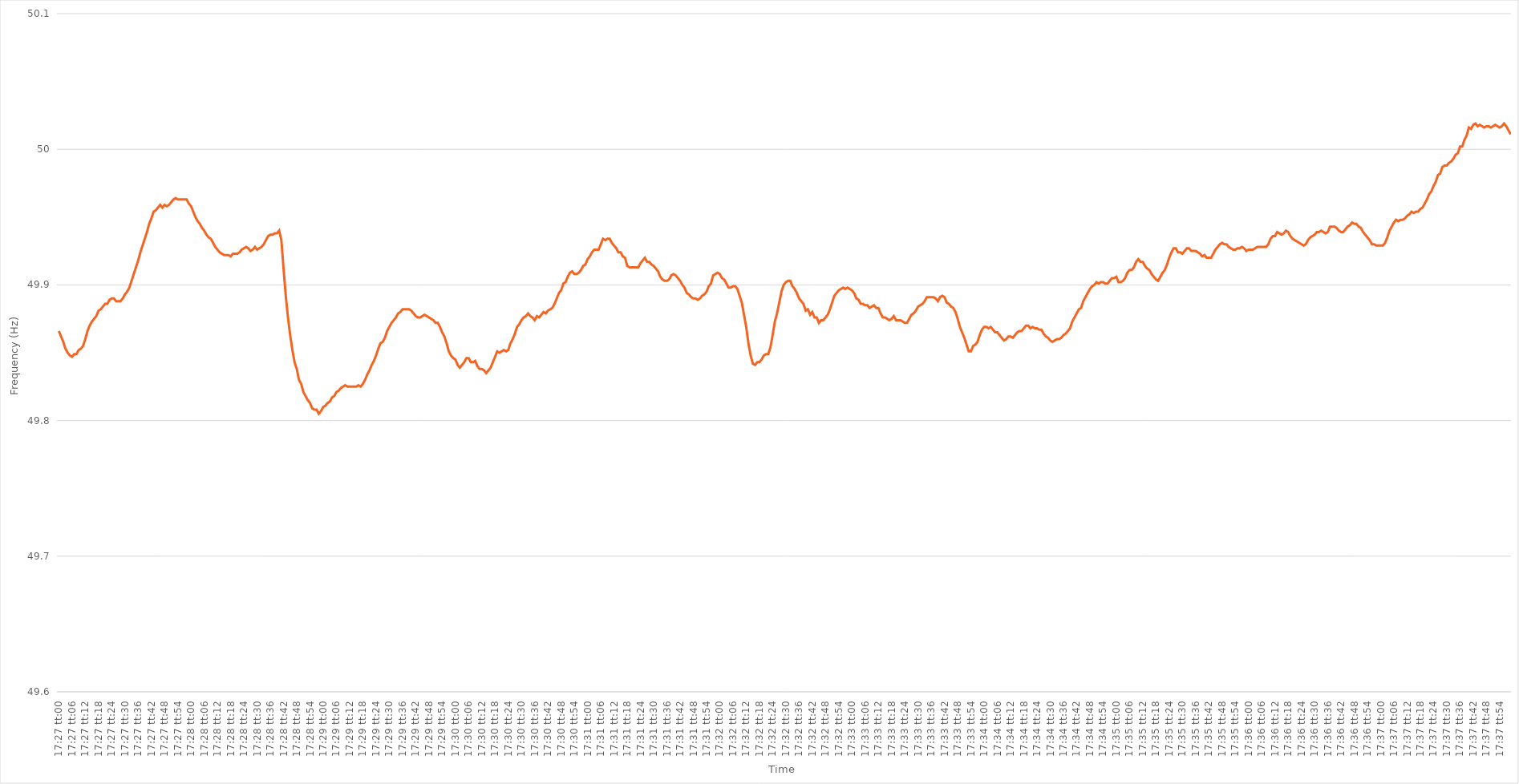
| Category | Series 0 |
|---|---|
| 0.7270833333333333 | 49.866 |
| 0.7270949074074075 | 49.862 |
| 0.7271064814814815 | 49.858 |
| 0.7271180555555555 | 49.853 |
| 0.7271296296296296 | 49.85 |
| 0.7271412037037037 | 49.848 |
| 0.7271527777777779 | 49.847 |
| 0.7271643518518518 | 49.849 |
| 0.727175925925926 | 49.849 |
| 0.7271875 | 49.852 |
| 0.7271990740740741 | 49.853 |
| 0.7272106481481481 | 49.855 |
| 0.7272222222222222 | 49.86 |
| 0.7272337962962964 | 49.866 |
| 0.7272453703703704 | 49.87 |
| 0.7272569444444444 | 49.873 |
| 0.7272685185185185 | 49.875 |
| 0.7272800925925926 | 49.877 |
| 0.7272916666666666 | 49.881 |
| 0.7273032407407407 | 49.882 |
| 0.7273148148148149 | 49.884 |
| 0.7273263888888889 | 49.886 |
| 0.7273379629629629 | 49.886 |
| 0.727349537037037 | 49.889 |
| 0.7273611111111111 | 49.89 |
| 0.7273726851851853 | 49.89 |
| 0.7273842592592592 | 49.888 |
| 0.7273958333333334 | 49.888 |
| 0.7274074074074074 | 49.888 |
| 0.7274189814814815 | 49.89 |
| 0.7274305555555555 | 49.893 |
| 0.7274421296296296 | 49.895 |
| 0.7274537037037038 | 49.898 |
| 0.7274652777777778 | 49.903 |
| 0.7274768518518518 | 49.908 |
| 0.7274884259259259 | 49.913 |
| 0.7275 | 49.918 |
| 0.727511574074074 | 49.924 |
| 0.7275231481481481 | 49.929 |
| 0.7275347222222223 | 49.934 |
| 0.7275462962962963 | 49.939 |
| 0.7275578703703703 | 49.945 |
| 0.7275694444444444 | 49.949 |
| 0.7275810185185185 | 49.954 |
| 0.7275925925925927 | 49.955 |
| 0.7276041666666666 | 49.957 |
| 0.7276157407407408 | 49.959 |
| 0.7276273148148148 | 49.957 |
| 0.727638888888889 | 49.959 |
| 0.7276504629629629 | 49.958 |
| 0.727662037037037 | 49.959 |
| 0.7276736111111112 | 49.961 |
| 0.7276851851851852 | 49.963 |
| 0.7276967592592593 | 49.964 |
| 0.7277083333333333 | 49.963 |
| 0.7277199074074074 | 49.963 |
| 0.7277314814814816 | 49.963 |
| 0.7277430555555555 | 49.963 |
| 0.7277546296296297 | 49.963 |
| 0.7277662037037037 | 49.96 |
| 0.7277777777777777 | 49.958 |
| 0.7277893518518518 | 49.954 |
| 0.7278009259259259 | 49.95 |
| 0.7278125000000001 | 49.947 |
| 0.727824074074074 | 49.945 |
| 0.7278356481481482 | 49.942 |
| 0.7278472222222222 | 49.94 |
| 0.7278587962962964 | 49.937 |
| 0.7278703703703703 | 49.935 |
| 0.7278819444444444 | 49.934 |
| 0.7278935185185186 | 49.931 |
| 0.7279050925925926 | 49.928 |
| 0.7279166666666667 | 49.926 |
| 0.7279282407407407 | 49.924 |
| 0.7279398148148148 | 49.923 |
| 0.727951388888889 | 49.922 |
| 0.7279629629629629 | 49.922 |
| 0.7279745370370371 | 49.922 |
| 0.7279861111111111 | 49.921 |
| 0.7279976851851852 | 49.923 |
| 0.7280092592592592 | 49.923 |
| 0.7280208333333333 | 49.923 |
| 0.7280324074074075 | 49.924 |
| 0.7280439814814814 | 49.926 |
| 0.7280555555555556 | 49.927 |
| 0.7280671296296296 | 49.928 |
| 0.7280787037037038 | 49.927 |
| 0.7280902777777777 | 49.925 |
| 0.7281018518518518 | 49.926 |
| 0.728113425925926 | 49.928 |
| 0.728125 | 49.926 |
| 0.7281365740740741 | 49.927 |
| 0.7281481481481481 | 49.928 |
| 0.7281597222222222 | 49.93 |
| 0.7281712962962964 | 49.933 |
| 0.7281828703703703 | 49.936 |
| 0.7281944444444445 | 49.937 |
| 0.7282060185185185 | 49.937 |
| 0.7282175925925927 | 49.938 |
| 0.7282291666666666 | 49.938 |
| 0.7282407407407407 | 49.94 |
| 0.7282523148148149 | 49.933 |
| 0.7282638888888888 | 49.912 |
| 0.728275462962963 | 49.892 |
| 0.728287037037037 | 49.876 |
| 0.7282986111111112 | 49.863 |
| 0.7283101851851851 | 49.852 |
| 0.7283217592592592 | 49.843 |
| 0.7283333333333334 | 49.838 |
| 0.7283449074074074 | 49.83 |
| 0.7283564814814815 | 49.827 |
| 0.7283680555555555 | 49.821 |
| 0.7283796296296297 | 49.818 |
| 0.7283912037037038 | 49.815 |
| 0.7284027777777777 | 49.813 |
| 0.7284143518518519 | 49.809 |
| 0.7284259259259259 | 49.808 |
| 0.7284375000000001 | 49.808 |
| 0.728449074074074 | 49.805 |
| 0.7284606481481481 | 49.807 |
| 0.7284722222222223 | 49.81 |
| 0.7284837962962962 | 49.811 |
| 0.7284953703703704 | 49.813 |
| 0.7285069444444444 | 49.814 |
| 0.7285185185185186 | 49.817 |
| 0.7285300925925925 | 49.818 |
| 0.7285416666666666 | 49.821 |
| 0.7285532407407408 | 49.822 |
| 0.7285648148148148 | 49.824 |
| 0.7285763888888889 | 49.825 |
| 0.7285879629629629 | 49.826 |
| 0.7285995370370371 | 49.825 |
| 0.7286111111111112 | 49.825 |
| 0.7286226851851851 | 49.825 |
| 0.7286342592592593 | 49.825 |
| 0.7286458333333333 | 49.825 |
| 0.7286574074074075 | 49.826 |
| 0.7286689814814814 | 49.825 |
| 0.7286805555555556 | 49.827 |
| 0.7286921296296297 | 49.83 |
| 0.7287037037037036 | 49.834 |
| 0.7287152777777778 | 49.837 |
| 0.7287268518518518 | 49.841 |
| 0.728738425925926 | 49.844 |
| 0.7287499999999999 | 49.848 |
| 0.728761574074074 | 49.853 |
| 0.7287731481481482 | 49.857 |
| 0.7287847222222222 | 49.858 |
| 0.7287962962962963 | 49.861 |
| 0.7288078703703703 | 49.866 |
| 0.7288194444444445 | 49.869 |
| 0.7288310185185186 | 49.872 |
| 0.7288425925925925 | 49.874 |
| 0.7288541666666667 | 49.876 |
| 0.7288657407407407 | 49.879 |
| 0.7288773148148149 | 49.88 |
| 0.7288888888888888 | 49.882 |
| 0.728900462962963 | 49.882 |
| 0.7289120370370371 | 49.882 |
| 0.728923611111111 | 49.882 |
| 0.7289351851851852 | 49.881 |
| 0.7289467592592592 | 49.879 |
| 0.7289583333333334 | 49.877 |
| 0.7289699074074073 | 49.876 |
| 0.7289814814814815 | 49.876 |
| 0.7289930555555556 | 49.877 |
| 0.7290046296296296 | 49.878 |
| 0.7290162037037037 | 49.877 |
| 0.7290277777777777 | 49.876 |
| 0.7290393518518519 | 49.875 |
| 0.729050925925926 | 49.874 |
| 0.7290625 | 49.872 |
| 0.7290740740740741 | 49.872 |
| 0.7290856481481481 | 49.869 |
| 0.7290972222222223 | 49.865 |
| 0.7291087962962962 | 49.862 |
| 0.7291203703703704 | 49.857 |
| 0.7291319444444445 | 49.851 |
| 0.7291435185185186 | 49.848 |
| 0.7291550925925926 | 49.846 |
| 0.7291666666666666 | 49.845 |
| 0.7291782407407408 | 49.841 |
| 0.7291898148148147 | 49.839 |
| 0.7292013888888889 | 49.841 |
| 0.729212962962963 | 49.843 |
| 0.729224537037037 | 49.846 |
| 0.7292361111111111 | 49.846 |
| 0.7292476851851851 | 49.843 |
| 0.7292592592592593 | 49.843 |
| 0.7292708333333334 | 49.844 |
| 0.7292824074074074 | 49.84 |
| 0.7292939814814815 | 49.838 |
| 0.7293055555555555 | 49.838 |
| 0.7293171296296297 | 49.837 |
| 0.7293287037037036 | 49.835 |
| 0.7293402777777778 | 49.837 |
| 0.7293518518518519 | 49.839 |
| 0.729363425925926 | 49.843 |
| 0.729375 | 49.847 |
| 0.729386574074074 | 49.851 |
| 0.7293981481481482 | 49.85 |
| 0.7294097222222223 | 49.851 |
| 0.7294212962962963 | 49.852 |
| 0.7294328703703704 | 49.851 |
| 0.7294444444444445 | 49.852 |
| 0.7294560185185185 | 49.857 |
| 0.7294675925925925 | 49.86 |
| 0.7294791666666667 | 49.864 |
| 0.7294907407407408 | 49.869 |
| 0.7295023148148148 | 49.871 |
| 0.7295138888888889 | 49.874 |
| 0.729525462962963 | 49.876 |
| 0.7295370370370371 | 49.877 |
| 0.729548611111111 | 49.879 |
| 0.7295601851851852 | 49.877 |
| 0.7295717592592593 | 49.876 |
| 0.7295833333333334 | 49.874 |
| 0.7295949074074074 | 49.877 |
| 0.7296064814814814 | 49.876 |
| 0.7296180555555556 | 49.878 |
| 0.7296296296296297 | 49.88 |
| 0.7296412037037037 | 49.879 |
| 0.7296527777777778 | 49.881 |
| 0.7296643518518519 | 49.882 |
| 0.7296759259259259 | 49.883 |
| 0.7296874999999999 | 49.886 |
| 0.7296990740740741 | 49.89 |
| 0.7297106481481482 | 49.894 |
| 0.7297222222222222 | 49.896 |
| 0.7297337962962963 | 49.901 |
| 0.7297453703703703 | 49.902 |
| 0.7297569444444445 | 49.906 |
| 0.7297685185185184 | 49.909 |
| 0.7297800925925926 | 49.91 |
| 0.7297916666666667 | 49.908 |
| 0.7298032407407408 | 49.908 |
| 0.7298148148148148 | 49.909 |
| 0.7298263888888888 | 49.911 |
| 0.729837962962963 | 49.914 |
| 0.7298495370370371 | 49.915 |
| 0.7298611111111111 | 49.919 |
| 0.7298726851851852 | 49.921 |
| 0.7298842592592593 | 49.924 |
| 0.7298958333333333 | 49.926 |
| 0.7299074074074073 | 49.926 |
| 0.7299189814814815 | 49.926 |
| 0.7299305555555556 | 49.93 |
| 0.7299421296296296 | 49.934 |
| 0.7299537037037037 | 49.933 |
| 0.7299652777777778 | 49.934 |
| 0.7299768518518519 | 49.934 |
| 0.7299884259259258 | 49.931 |
| 0.73 | 49.929 |
| 0.7300115740740741 | 49.927 |
| 0.7300231481481482 | 49.924 |
| 0.7300347222222222 | 49.924 |
| 0.7300462962962962 | 49.921 |
| 0.7300578703703704 | 49.92 |
| 0.7300694444444445 | 49.914 |
| 0.7300810185185185 | 49.913 |
| 0.7300925925925926 | 49.913 |
| 0.7301041666666667 | 49.913 |
| 0.7301157407407407 | 49.913 |
| 0.7301273148148147 | 49.913 |
| 0.7301388888888889 | 49.916 |
| 0.730150462962963 | 49.918 |
| 0.730162037037037 | 49.92 |
| 0.7301736111111111 | 49.917 |
| 0.7301851851851852 | 49.917 |
| 0.7301967592592593 | 49.915 |
| 0.7302083333333332 | 49.914 |
| 0.7302199074074074 | 49.912 |
| 0.7302314814814815 | 49.91 |
| 0.7302430555555556 | 49.906 |
| 0.7302546296296296 | 49.904 |
| 0.7302662037037037 | 49.903 |
| 0.7302777777777778 | 49.903 |
| 0.730289351851852 | 49.904 |
| 0.7303009259259259 | 49.907 |
| 0.7303125 | 49.908 |
| 0.7303240740740741 | 49.907 |
| 0.7303356481481482 | 49.905 |
| 0.7303472222222221 | 49.903 |
| 0.7303587962962963 | 49.9 |
| 0.7303703703703704 | 49.898 |
| 0.7303819444444444 | 49.894 |
| 0.7303935185185185 | 49.893 |
| 0.7304050925925926 | 49.891 |
| 0.7304166666666667 | 49.89 |
| 0.7304282407407406 | 49.89 |
| 0.7304398148148148 | 49.889 |
| 0.7304513888888889 | 49.89 |
| 0.730462962962963 | 49.892 |
| 0.730474537037037 | 49.893 |
| 0.7304861111111111 | 49.895 |
| 0.7304976851851852 | 49.899 |
| 0.7305092592592594 | 49.901 |
| 0.7305208333333333 | 49.907 |
| 0.7305324074074074 | 49.908 |
| 0.7305439814814815 | 49.909 |
| 0.7305555555555556 | 49.908 |
| 0.7305671296296296 | 49.905 |
| 0.7305787037037037 | 49.904 |
| 0.7305902777777779 | 49.901 |
| 0.7306018518518519 | 49.898 |
| 0.7306134259259259 | 49.898 |
| 0.730625 | 49.899 |
| 0.7306365740740741 | 49.899 |
| 0.730648148148148 | 49.897 |
| 0.7306597222222222 | 49.892 |
| 0.7306712962962963 | 49.887 |
| 0.7306828703703704 | 49.878 |
| 0.7306944444444444 | 49.869 |
| 0.7307060185185185 | 49.857 |
| 0.7307175925925926 | 49.848 |
| 0.7307291666666668 | 49.842 |
| 0.7307407407407407 | 49.841 |
| 0.7307523148148148 | 49.843 |
| 0.7307638888888889 | 49.843 |
| 0.730775462962963 | 49.845 |
| 0.730787037037037 | 49.848 |
| 0.7307986111111111 | 49.849 |
| 0.7308101851851853 | 49.849 |
| 0.7308217592592593 | 49.854 |
| 0.7308333333333333 | 49.863 |
| 0.7308449074074074 | 49.873 |
| 0.7308564814814815 | 49.879 |
| 0.7308680555555555 | 49.887 |
| 0.7308796296296296 | 49.895 |
| 0.7308912037037038 | 49.9 |
| 0.7309027777777778 | 49.902 |
| 0.7309143518518518 | 49.903 |
| 0.7309259259259259 | 49.903 |
| 0.7309375 | 49.899 |
| 0.7309490740740742 | 49.897 |
| 0.7309606481481481 | 49.894 |
| 0.7309722222222222 | 49.89 |
| 0.7309837962962963 | 49.888 |
| 0.7309953703703704 | 49.886 |
| 0.7310069444444444 | 49.881 |
| 0.7310185185185185 | 49.882 |
| 0.7310300925925927 | 49.878 |
| 0.7310416666666667 | 49.88 |
| 0.7310532407407407 | 49.876 |
| 0.7310648148148148 | 49.876 |
| 0.7310763888888889 | 49.872 |
| 0.7310879629629629 | 49.874 |
| 0.731099537037037 | 49.874 |
| 0.7311111111111112 | 49.876 |
| 0.7311226851851852 | 49.878 |
| 0.7311342592592592 | 49.882 |
| 0.7311458333333333 | 49.887 |
| 0.7311574074074074 | 49.892 |
| 0.7311689814814816 | 49.894 |
| 0.7311805555555555 | 49.896 |
| 0.7311921296296297 | 49.897 |
| 0.7312037037037037 | 49.898 |
| 0.7312152777777778 | 49.897 |
| 0.7312268518518518 | 49.898 |
| 0.7312384259259259 | 49.897 |
| 0.7312500000000001 | 49.896 |
| 0.7312615740740741 | 49.894 |
| 0.7312731481481481 | 49.89 |
| 0.7312847222222222 | 49.889 |
| 0.7312962962962963 | 49.886 |
| 0.7313078703703703 | 49.886 |
| 0.7313194444444444 | 49.885 |
| 0.7313310185185186 | 49.885 |
| 0.7313425925925926 | 49.883 |
| 0.7313541666666666 | 49.884 |
| 0.7313657407407407 | 49.885 |
| 0.7313773148148148 | 49.883 |
| 0.731388888888889 | 49.883 |
| 0.7314004629629629 | 49.879 |
| 0.731412037037037 | 49.876 |
| 0.7314236111111111 | 49.876 |
| 0.7314351851851852 | 49.875 |
| 0.7314467592592592 | 49.874 |
| 0.7314583333333333 | 49.875 |
| 0.7314699074074075 | 49.877 |
| 0.7314814814814815 | 49.874 |
| 0.7314930555555555 | 49.874 |
| 0.7315046296296296 | 49.874 |
| 0.7315162037037037 | 49.873 |
| 0.7315277777777777 | 49.872 |
| 0.7315393518518518 | 49.872 |
| 0.731550925925926 | 49.875 |
| 0.7315625 | 49.878 |
| 0.731574074074074 | 49.879 |
| 0.7315856481481481 | 49.881 |
| 0.7315972222222222 | 49.884 |
| 0.7316087962962964 | 49.885 |
| 0.7316203703703703 | 49.886 |
| 0.7316319444444445 | 49.888 |
| 0.7316435185185185 | 49.891 |
| 0.7316550925925926 | 49.891 |
| 0.7316666666666666 | 49.891 |
| 0.7316782407407407 | 49.891 |
| 0.7316898148148149 | 49.89 |
| 0.7317013888888889 | 49.888 |
| 0.731712962962963 | 49.891 |
| 0.731724537037037 | 49.892 |
| 0.7317361111111111 | 49.891 |
| 0.7317476851851853 | 49.887 |
| 0.7317592592592592 | 49.886 |
| 0.7317708333333334 | 49.884 |
| 0.7317824074074074 | 49.883 |
| 0.7317939814814814 | 49.88 |
| 0.7318055555555555 | 49.875 |
| 0.7318171296296296 | 49.869 |
| 0.7318287037037038 | 49.865 |
| 0.7318402777777777 | 49.861 |
| 0.7318518518518519 | 49.856 |
| 0.7318634259259259 | 49.851 |
| 0.731875 | 49.851 |
| 0.731886574074074 | 49.855 |
| 0.7318981481481481 | 49.856 |
| 0.7319097222222223 | 49.858 |
| 0.7319212962962963 | 49.863 |
| 0.7319328703703704 | 49.867 |
| 0.7319444444444444 | 49.869 |
| 0.7319560185185185 | 49.869 |
| 0.7319675925925927 | 49.868 |
| 0.7319791666666666 | 49.869 |
| 0.7319907407407408 | 49.867 |
| 0.7320023148148148 | 49.865 |
| 0.732013888888889 | 49.865 |
| 0.7320254629629629 | 49.863 |
| 0.732037037037037 | 49.861 |
| 0.7320486111111112 | 49.859 |
| 0.7320601851851851 | 49.86 |
| 0.7320717592592593 | 49.862 |
| 0.7320833333333333 | 49.862 |
| 0.7320949074074075 | 49.861 |
| 0.7321064814814814 | 49.863 |
| 0.7321180555555555 | 49.865 |
| 0.7321296296296297 | 49.866 |
| 0.7321412037037037 | 49.866 |
| 0.7321527777777778 | 49.868 |
| 0.7321643518518518 | 49.87 |
| 0.732175925925926 | 49.87 |
| 0.7321875000000001 | 49.868 |
| 0.732199074074074 | 49.869 |
| 0.7322106481481482 | 49.868 |
| 0.7322222222222222 | 49.868 |
| 0.7322337962962964 | 49.867 |
| 0.7322453703703703 | 49.867 |
| 0.7322569444444444 | 49.864 |
| 0.7322685185185186 | 49.862 |
| 0.7322800925925925 | 49.861 |
| 0.7322916666666667 | 49.859 |
| 0.7323032407407407 | 49.858 |
| 0.7323148148148149 | 49.859 |
| 0.7323263888888888 | 49.86 |
| 0.7323379629629629 | 49.86 |
| 0.7323495370370371 | 49.861 |
| 0.7323611111111111 | 49.863 |
| 0.7323726851851852 | 49.864 |
| 0.7323842592592592 | 49.866 |
| 0.7323958333333334 | 49.868 |
| 0.7324074074074075 | 49.873 |
| 0.7324189814814814 | 49.876 |
| 0.7324305555555556 | 49.879 |
| 0.7324421296296296 | 49.882 |
| 0.7324537037037038 | 49.883 |
| 0.7324652777777777 | 49.888 |
| 0.7324768518518519 | 49.891 |
| 0.732488425925926 | 49.894 |
| 0.7324999999999999 | 49.897 |
| 0.7325115740740741 | 49.899 |
| 0.7325231481481481 | 49.9 |
| 0.7325347222222223 | 49.902 |
| 0.7325462962962962 | 49.901 |
| 0.7325578703703703 | 49.902 |
| 0.7325694444444445 | 49.902 |
| 0.7325810185185185 | 49.901 |
| 0.7325925925925926 | 49.901 |
| 0.7326041666666666 | 49.903 |
| 0.7326157407407408 | 49.905 |
| 0.7326273148148149 | 49.905 |
| 0.7326388888888888 | 49.906 |
| 0.732650462962963 | 49.902 |
| 0.732662037037037 | 49.902 |
| 0.7326736111111112 | 49.903 |
| 0.7326851851851851 | 49.905 |
| 0.7326967592592593 | 49.909 |
| 0.7327083333333334 | 49.911 |
| 0.7327199074074073 | 49.911 |
| 0.7327314814814815 | 49.913 |
| 0.7327430555555555 | 49.917 |
| 0.7327546296296297 | 49.919 |
| 0.7327662037037036 | 49.917 |
| 0.7327777777777778 | 49.917 |
| 0.7327893518518519 | 49.914 |
| 0.7328009259259259 | 49.912 |
| 0.7328125 | 49.911 |
| 0.732824074074074 | 49.908 |
| 0.7328356481481482 | 49.906 |
| 0.7328472222222223 | 49.904 |
| 0.7328587962962962 | 49.903 |
| 0.7328703703703704 | 49.906 |
| 0.7328819444444444 | 49.909 |
| 0.7328935185185186 | 49.911 |
| 0.7329050925925925 | 49.915 |
| 0.7329166666666667 | 49.92 |
| 0.7329282407407408 | 49.924 |
| 0.7329398148148147 | 49.927 |
| 0.7329513888888889 | 49.927 |
| 0.7329629629629629 | 49.924 |
| 0.7329745370370371 | 49.924 |
| 0.732986111111111 | 49.923 |
| 0.7329976851851852 | 49.925 |
| 0.7330092592592593 | 49.927 |
| 0.7330208333333333 | 49.927 |
| 0.7330324074074074 | 49.925 |
| 0.7330439814814814 | 49.925 |
| 0.7330555555555556 | 49.925 |
| 0.7330671296296297 | 49.924 |
| 0.7330787037037036 | 49.923 |
| 0.7330902777777778 | 49.921 |
| 0.7331018518518518 | 49.922 |
| 0.733113425925926 | 49.92 |
| 0.7331249999999999 | 49.92 |
| 0.7331365740740741 | 49.92 |
| 0.7331481481481482 | 49.923 |
| 0.7331597222222223 | 49.926 |
| 0.7331712962962963 | 49.928 |
| 0.7331828703703703 | 49.93 |
| 0.7331944444444445 | 49.931 |
| 0.7332060185185186 | 49.93 |
| 0.7332175925925926 | 49.93 |
| 0.7332291666666667 | 49.928 |
| 0.7332407407407407 | 49.927 |
| 0.7332523148148148 | 49.926 |
| 0.7332638888888888 | 49.926 |
| 0.733275462962963 | 49.927 |
| 0.7332870370370371 | 49.927 |
| 0.733298611111111 | 49.928 |
| 0.7333101851851852 | 49.927 |
| 0.7333217592592592 | 49.925 |
| 0.7333333333333334 | 49.926 |
| 0.7333449074074073 | 49.926 |
| 0.7333564814814815 | 49.926 |
| 0.7333680555555556 | 49.927 |
| 0.7333796296296297 | 49.928 |
| 0.7333912037037037 | 49.928 |
| 0.7334027777777777 | 49.928 |
| 0.7334143518518519 | 49.928 |
| 0.733425925925926 | 49.928 |
| 0.7334375 | 49.93 |
| 0.7334490740740741 | 49.934 |
| 0.7334606481481482 | 49.936 |
| 0.7334722222222222 | 49.936 |
| 0.7334837962962962 | 49.939 |
| 0.7334953703703704 | 49.938 |
| 0.7335069444444445 | 49.937 |
| 0.7335185185185185 | 49.938 |
| 0.7335300925925926 | 49.94 |
| 0.7335416666666666 | 49.939 |
| 0.7335532407407408 | 49.936 |
| 0.7335648148148147 | 49.934 |
| 0.7335763888888889 | 49.933 |
| 0.733587962962963 | 49.932 |
| 0.7335995370370371 | 49.931 |
| 0.7336111111111111 | 49.93 |
| 0.7336226851851851 | 49.929 |
| 0.7336342592592593 | 49.93 |
| 0.7336458333333334 | 49.933 |
| 0.7336574074074074 | 49.935 |
| 0.7336689814814815 | 49.936 |
| 0.7336805555555556 | 49.937 |
| 0.7336921296296296 | 49.939 |
| 0.7337037037037036 | 49.939 |
| 0.7337152777777778 | 49.94 |
| 0.7337268518518519 | 49.939 |
| 0.7337384259259259 | 49.938 |
| 0.73375 | 49.939 |
| 0.733761574074074 | 49.943 |
| 0.7337731481481482 | 49.943 |
| 0.7337847222222221 | 49.943 |
| 0.7337962962962963 | 49.942 |
| 0.7338078703703704 | 49.94 |
| 0.7338194444444445 | 49.939 |
| 0.7338310185185185 | 49.939 |
| 0.7338425925925925 | 49.941 |
| 0.7338541666666667 | 49.943 |
| 0.7338657407407408 | 49.944 |
| 0.7338773148148148 | 49.946 |
| 0.7338888888888889 | 49.945 |
| 0.733900462962963 | 49.945 |
| 0.733912037037037 | 49.943 |
| 0.733923611111111 | 49.942 |
| 0.7339351851851852 | 49.939 |
| 0.7339467592592593 | 49.937 |
| 0.7339583333333333 | 49.935 |
| 0.7339699074074074 | 49.933 |
| 0.7339814814814815 | 49.93 |
| 0.7339930555555556 | 49.93 |
| 0.7340046296296295 | 49.929 |
| 0.7340162037037037 | 49.929 |
| 0.7340277777777778 | 49.929 |
| 0.7340393518518519 | 49.929 |
| 0.7340509259259259 | 49.931 |
| 0.7340625 | 49.935 |
| 0.7340740740740741 | 49.94 |
| 0.7340856481481483 | 49.943 |
| 0.7340972222222222 | 49.946 |
| 0.7341087962962963 | 49.948 |
| 0.7341203703703704 | 49.947 |
| 0.7341319444444444 | 49.948 |
| 0.7341435185185184 | 49.948 |
| 0.7341550925925926 | 49.949 |
| 0.7341666666666667 | 49.951 |
| 0.7341782407407407 | 49.952 |
| 0.7341898148148148 | 49.954 |
| 0.7342013888888889 | 49.953 |
| 0.734212962962963 | 49.954 |
| 0.7342245370370369 | 49.954 |
| 0.7342361111111111 | 49.956 |
| 0.7342476851851852 | 49.957 |
| 0.7342592592592593 | 49.96 |
| 0.7342708333333333 | 49.963 |
| 0.7342824074074074 | 49.967 |
| 0.7342939814814815 | 49.969 |
| 0.7343055555555557 | 49.973 |
| 0.7343171296296296 | 49.976 |
| 0.7343287037037037 | 49.981 |
| 0.7343402777777778 | 49.982 |
| 0.7343518518518519 | 49.987 |
| 0.7343634259259259 | 49.988 |
| 0.734375 | 49.988 |
| 0.7343865740740741 | 49.99 |
| 0.7343981481481481 | 49.991 |
| 0.7344097222222222 | 49.993 |
| 0.7344212962962963 | 49.996 |
| 0.7344328703703704 | 49.997 |
| 0.7344444444444443 | 50.002 |
| 0.7344560185185185 | 50.002 |
| 0.7344675925925926 | 50.007 |
| 0.7344791666666667 | 50.01 |
| 0.7344907407407407 | 50.016 |
| 0.7345023148148148 | 50.015 |
| 0.7345138888888889 | 50.018 |
| 0.7345254629629631 | 50.019 |
| 0.734537037037037 | 50.017 |
| 0.7345486111111111 | 50.018 |
| 0.7345601851851852 | 50.017 |
| 0.7345717592592593 | 50.016 |
| 0.7345833333333333 | 50.017 |
| 0.7345949074074074 | 50.017 |
| 0.7346064814814816 | 50.016 |
| 0.7346180555555556 | 50.017 |
| 0.7346296296296296 | 50.018 |
| 0.7346412037037037 | 50.017 |
| 0.7346527777777778 | 50.016 |
| 0.7346643518518517 | 50.017 |
| 0.7346759259259259 | 50.019 |
| 0.7346875 | 50.017 |
| 0.7346990740740741 | 50.014 |
| 0.7347106481481481 | 50.011 |